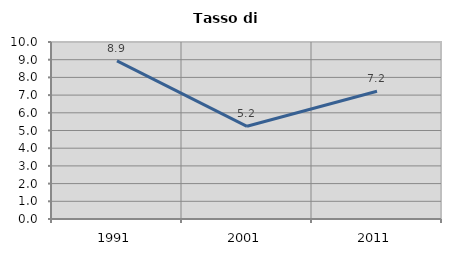
| Category | Tasso di disoccupazione   |
|---|---|
| 1991.0 | 8.933 |
| 2001.0 | 5.237 |
| 2011.0 | 7.215 |